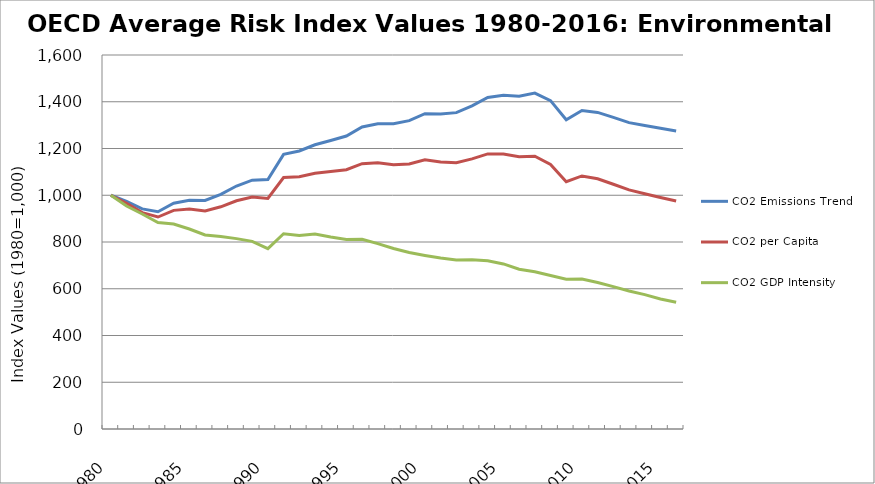
| Category | CO2 Emissions Trend | CO2 per Capita | CO2 GDP Intensity |
|---|---|---|---|
| 1980.0 | 1000 | 1000 | 1000 |
| 1981.0 | 973.666 | 965.186 | 953.722 |
| 1982.0 | 941.604 | 925.737 | 919.904 |
| 1983.0 | 929.621 | 906.843 | 883.214 |
| 1984.0 | 965.939 | 935.313 | 877.158 |
| 1985.0 | 978.761 | 940.724 | 855.666 |
| 1986.0 | 977.677 | 932.523 | 829.942 |
| 1987.0 | 1004.147 | 950.579 | 823.753 |
| 1988.0 | 1039.479 | 976.567 | 814.415 |
| 1989.0 | 1064.43 | 991.995 | 802.627 |
| 1990.0 | 1067.43 | 986.339 | 771.563 |
| 1991.0 | 1174.762 | 1075.747 | 835.393 |
| 1992.0 | 1189.234 | 1079.107 | 827.418 |
| 1993.0 | 1215.96 | 1093.85 | 834.543 |
| 1994.0 | 1234.278 | 1101.337 | 821.607 |
| 1995.0 | 1253.248 | 1109.473 | 811.157 |
| 1996.0 | 1292.172 | 1135.252 | 812.026 |
| 1997.0 | 1306.09 | 1138.9 | 792.968 |
| 1998.0 | 1306.175 | 1130.856 | 772.169 |
| 1999.0 | 1319.15 | 1134.012 | 754.91 |
| 2000.0 | 1348.896 | 1151.641 | 742.51 |
| 2001.0 | 1347.188 | 1142.022 | 731.364 |
| 2002.0 | 1353.482 | 1139.235 | 723.324 |
| 2003.0 | 1382.414 | 1155.392 | 724.327 |
| 2004.0 | 1418.075 | 1176.831 | 720.046 |
| 2005.0 | 1427.818 | 1176.589 | 706.25 |
| 2006.0 | 1423.659 | 1164.614 | 683.776 |
| 2007.0 | 1437.184 | 1166.882 | 672.901 |
| 2008.0 | 1404.772 | 1131.646 | 656.531 |
| 2009.0 | 1322.717 | 1057.924 | 640.927 |
| 2010.0 | 1362.557 | 1082.555 | 641.503 |
| 2011.0 | 1354.325 | 1070.477 | 626.738 |
| 2012.0 | 1332.995 | 1047.021 | 609.182 |
| 2013.0 | 1310.676 | 1022.872 | 590.562 |
| 2014.0 | 1298.501 | 1006.647 | 574.982 |
| 2015.0 | 1286.389 | 990.61 | 556.165 |
| 2016.0 | 1275.145 | 975.376 | 541.992 |